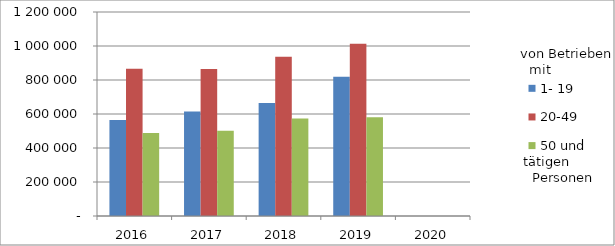
| Category | 1- 19 | 20-49 | 50 und mehr |
|---|---|---|---|
| 2016.0 | 564927.004 | 866402.513 | 488953.198 |
| 2017.0 | 614803.76 | 865068.807 | 500968.958 |
| 2018.0 | 664851.298 | 937490.312 | 572802.95 |
| 2019.0 | 818979.303 | 1012806.333 | 580363.324 |
| 2020.0 | 0 | 0 | 0 |